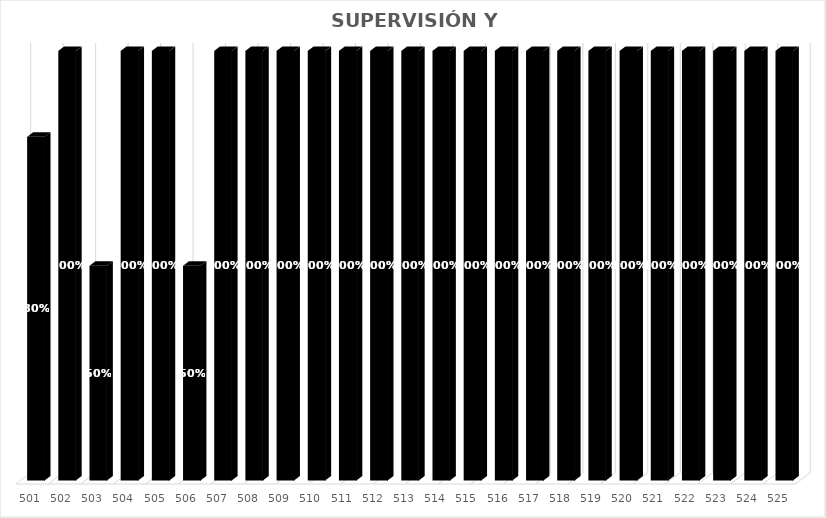
| Category | % Avance |
|---|---|
| 501.0 | 0.8 |
| 502.0 | 1 |
| 503.0 | 0.5 |
| 504.0 | 1 |
| 505.0 | 1 |
| 506.0 | 0.5 |
| 507.0 | 1 |
| 508.0 | 1 |
| 509.0 | 1 |
| 510.0 | 1 |
| 511.0 | 1 |
| 512.0 | 1 |
| 513.0 | 1 |
| 514.0 | 1 |
| 515.0 | 1 |
| 516.0 | 1 |
| 517.0 | 1 |
| 518.0 | 1 |
| 519.0 | 1 |
| 520.0 | 1 |
| 521.0 | 1 |
| 522.0 | 1 |
| 523.0 | 1 |
| 524.0 | 1 |
| 525.0 | 1 |